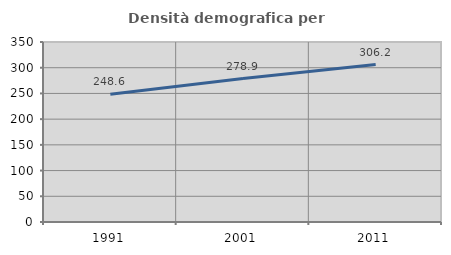
| Category | Densità demografica |
|---|---|
| 1991.0 | 248.599 |
| 2001.0 | 278.945 |
| 2011.0 | 306.192 |